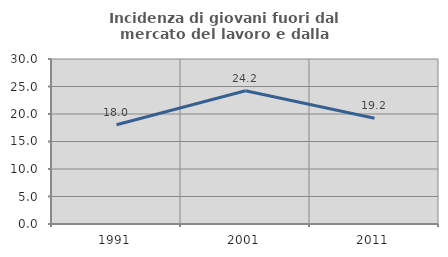
| Category | Incidenza di giovani fuori dal mercato del lavoro e dalla formazione  |
|---|---|
| 1991.0 | 18.043 |
| 2001.0 | 24.214 |
| 2011.0 | 19.219 |